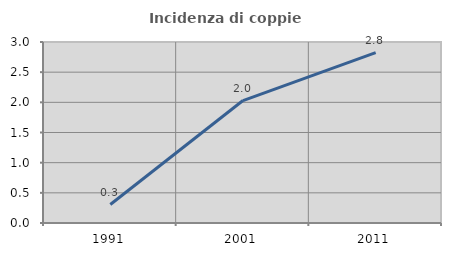
| Category | Incidenza di coppie miste |
|---|---|
| 1991.0 | 0.306 |
| 2001.0 | 2.03 |
| 2011.0 | 2.824 |